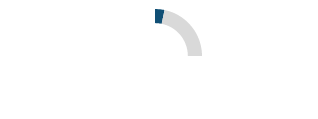
| Category | Series 0 |
|---|---|
| 0 | 0.033 |
| 1 | 0.217 |
| 2 | 0.75 |